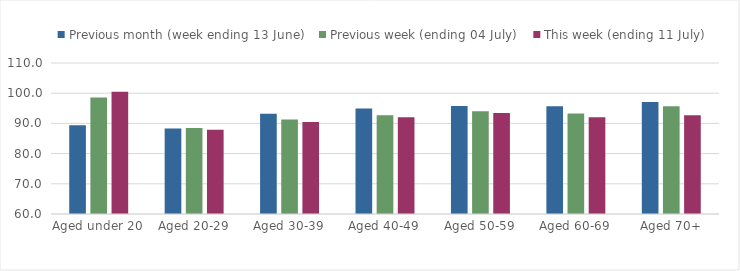
| Category | Previous month (week ending 13 June) | Previous week (ending 04 July) | This week (ending 11 July) |
|---|---|---|---|
| Aged under 20 | 89.376 | 98.583 | 100.454 |
| Aged 20-29 | 88.306 | 88.481 | 87.91 |
| Aged 30-39 | 93.23 | 91.32 | 90.437 |
| Aged 40-49 | 94.923 | 92.68 | 92.037 |
| Aged 50-59 | 95.785 | 93.988 | 93.406 |
| Aged 60-69 | 95.702 | 93.255 | 92.024 |
| Aged 70+ | 97.098 | 95.709 | 92.679 |